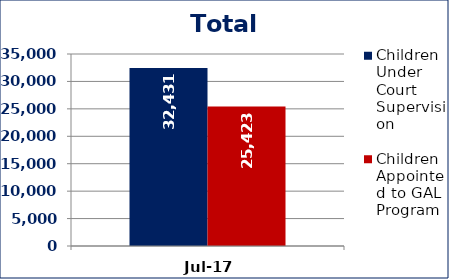
| Category | Children Under Court Supervision  | Children Appointed to GAL Program  |
|---|---|---|
| Jul-17 | 32431 | 25423 |